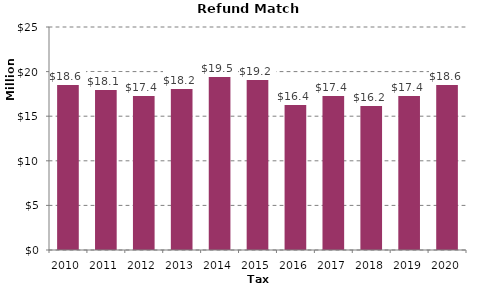
| Category | Total |
|---|---|
| 2010.0 | 18578293.82 |
| 2011.0 | 18104923.31 |
| 2012.0 | 17368776.62 |
| 2013.0 | 18211926.47 |
| 2014.0 | 19469019.92 |
| 2015.0 | 19206043.66 |
| 2016.0 | 16359793.29 |
| 2017.0 | 17431562.34 |
| 2018.0 | 16204019.57 |
| 2019.0 | 17428289.38 |
| 2020.0 | 18570711.95 |